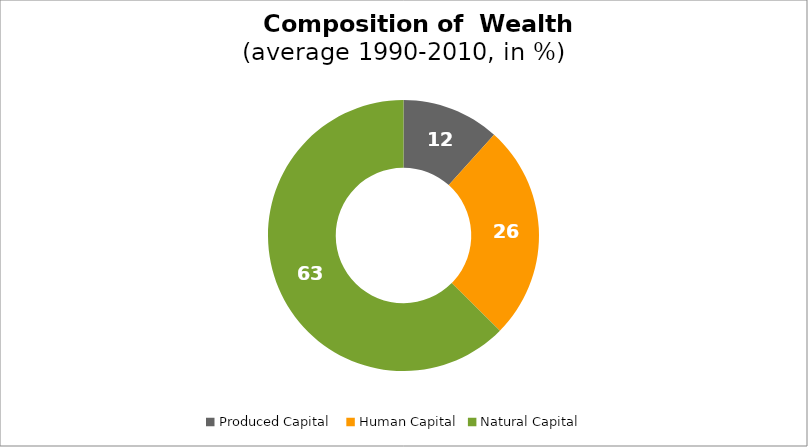
| Category | Series 0 |
|---|---|
| Produced Capital  | 11.651 |
| Human Capital | 25.753 |
| Natural Capital | 62.596 |